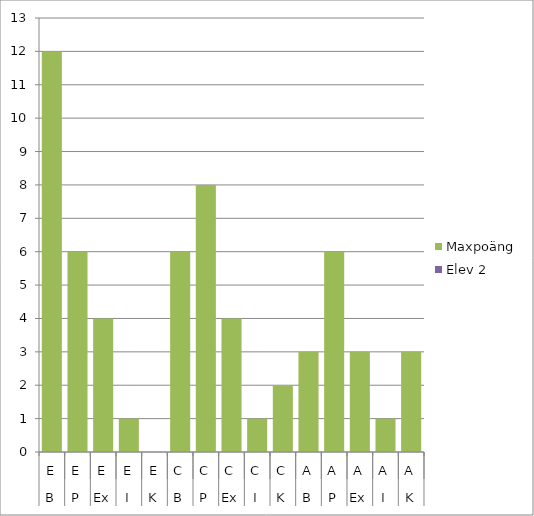
| Category | Maxpoäng | Elev 2 |
|---|---|---|
| 0 | 12 | 0 |
| 1 | 6 | 0 |
| 2 | 4 | 0 |
| 3 | 1 | 0 |
| 4 | 0 | 0 |
| 5 | 6 | 0 |
| 6 | 8 | 0 |
| 7 | 4 | 0 |
| 8 | 1 | 0 |
| 9 | 2 | 0 |
| 10 | 3 | 0 |
| 11 | 6 | 0 |
| 12 | 3 | 0 |
| 13 | 1 | 0 |
| 14 | 3 | 0 |